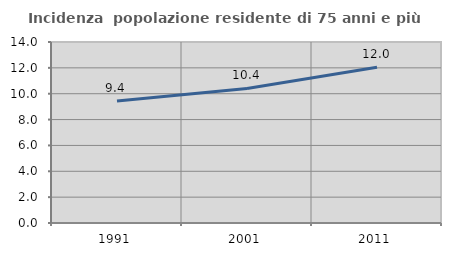
| Category | Incidenza  popolazione residente di 75 anni e più |
|---|---|
| 1991.0 | 9.427 |
| 2001.0 | 10.404 |
| 2011.0 | 12.046 |